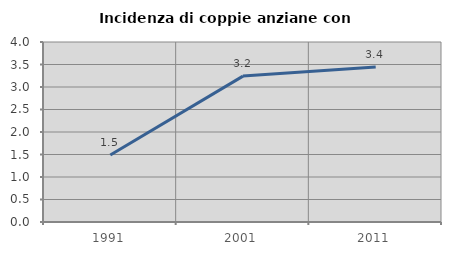
| Category | Incidenza di coppie anziane con figli |
|---|---|
| 1991.0 | 1.488 |
| 2001.0 | 3.242 |
| 2011.0 | 3.444 |